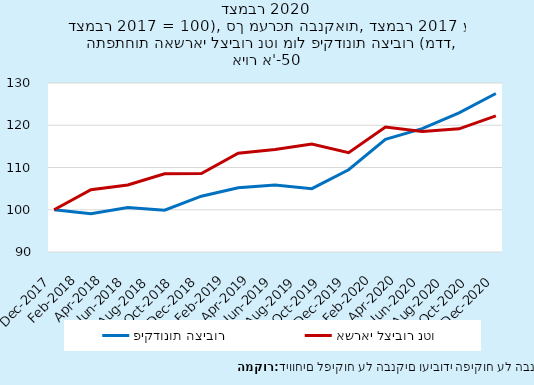
| Category | פיקדונות הציבור |
|---|---|
| 12/31/17 | 100 |
| 3/31/18 | 99.074 |
| 6/30/18 | 100.551 |
| 9/30/18 | 99.89 |
| 12/31/18 | 103.212 |
| 3/31/19 | 105.215 |
| 6/30/19 | 105.866 |
| 9/30/19 | 104.993 |
| 12/31/19 | 109.473 |
| 3/31/20 | 116.659 |
| 6/30/20 | 119.21 |
| 9/30/20 | 122.918 |
| 12/31/20 | 127.509 |